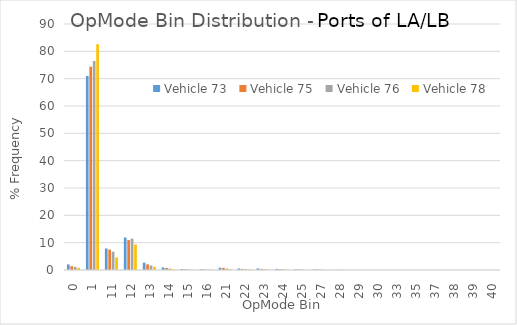
| Category | Vehicle 73 | Vehicle 75 | Vehicle 76 | Vehicle 78 |
|---|---|---|---|---|
| 0.0 | 2.026 | 1.399 | 1.147 | 0.769 |
| 1.0 | 70.971 | 74.396 | 76.457 | 82.568 |
| 11.0 | 7.867 | 7.464 | 6.685 | 4.572 |
| 12.0 | 11.88 | 10.945 | 11.47 | 9.31 |
| 13.0 | 2.685 | 2.071 | 1.652 | 1.155 |
| 14.0 | 0.938 | 0.731 | 0.513 | 0.314 |
| 15.0 | 0.372 | 0.297 | 0.199 | 0.093 |
| 16.0 | 0.273 | 0.223 | 0.163 | 0.099 |
| 21.0 | 0.851 | 0.759 | 0.524 | 0.31 |
| 22.0 | 0.565 | 0.399 | 0.328 | 0.209 |
| 23.0 | 0.59 | 0.394 | 0.301 | 0.208 |
| 24.0 | 0.414 | 0.304 | 0.213 | 0.17 |
| 25.0 | 0.241 | 0.203 | 0.131 | 0.101 |
| 27.0 | 0.208 | 0.213 | 0.127 | 0.081 |
| 28.0 | 0.067 | 0.085 | 0.046 | 0.028 |
| 29.0 | 0.025 | 0.03 | 0.015 | 0.008 |
| 30.0 | 0.018 | 0.018 | 0.012 | 0.005 |
| 33.0 | 0.004 | 0.032 | 0.006 | 0 |
| 35.0 | 0.003 | 0.016 | 0.005 | 0 |
| 37.0 | 0.001 | 0.012 | 0.003 | 0 |
| 38.0 | 0.001 | 0.005 | 0.001 | 0 |
| 39.0 | 0 | 0.002 | 0 | 0 |
| 40.0 | 0 | 0.002 | 0 | 0 |